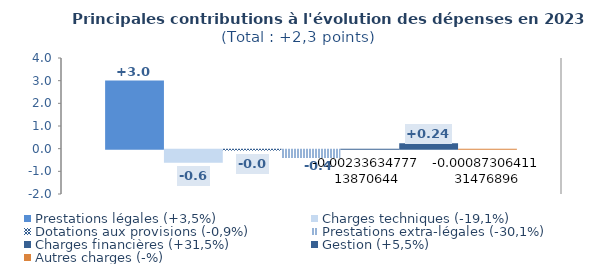
| Category | Prestations légales (+3,5%) | Charges techniques (-19,1%) | Dotations aux provisions (-0,9%) | Prestations extra-légales (-30,1%) | Charges financières (+31,5%) | Gestion (+5,5%) | Autres charges (-%) |
|---|---|---|---|---|---|---|---|
| 0 | 3.011 | -0.577 | -0.043 | -0.365 |  | 0.244 |  |